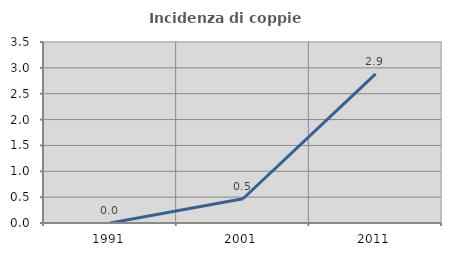
| Category | Incidenza di coppie miste |
|---|---|
| 1991.0 | 0 |
| 2001.0 | 0.469 |
| 2011.0 | 2.885 |